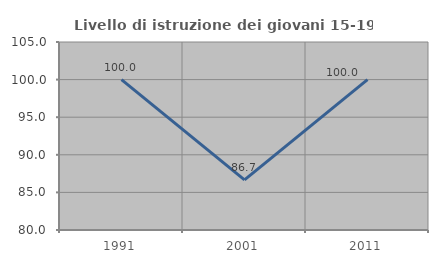
| Category | Livello di istruzione dei giovani 15-19 anni |
|---|---|
| 1991.0 | 100 |
| 2001.0 | 86.667 |
| 2011.0 | 100 |